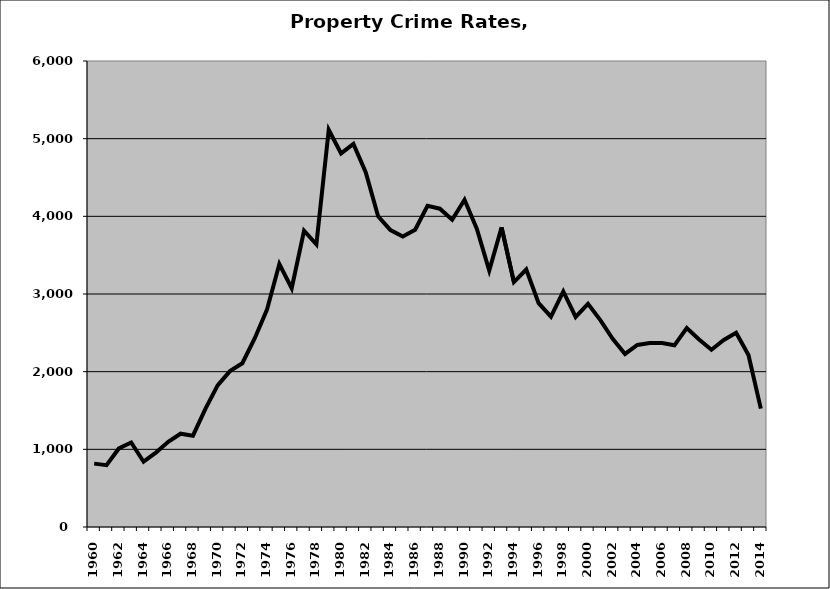
| Category | Property |
|---|---|
| 1960.0 | 815.89 |
| 1961.0 | 796.709 |
| 1962.0 | 1011.282 |
| 1963.0 | 1087.692 |
| 1964.0 | 840.587 |
| 1965.0 | 957.935 |
| 1966.0 | 1097.284 |
| 1967.0 | 1201.199 |
| 1968.0 | 1175.355 |
| 1969.0 | 1517.995 |
| 1970.0 | 1823.12 |
| 1971.0 | 2007.642 |
| 1972.0 | 2108.225 |
| 1973.0 | 2427.586 |
| 1974.0 | 2799.574 |
| 1975.0 | 3385.987 |
| 1976.0 | 3073.95 |
| 1977.0 | 3814.493 |
| 1978.0 | 3640.246 |
| 1979.0 | 5115.01 |
| 1980.0 | 4809.71 |
| 1981.0 | 4932.816 |
| 1982.0 | 4564.922 |
| 1983.0 | 4000.19 |
| 1984.0 | 3822.83 |
| 1985.0 | 3740.374 |
| 1986.0 | 3827.726 |
| 1987.0 | 4134.672 |
| 1988.0 | 4098.201 |
| 1989.0 | 3955.732 |
| 1990.0 | 4213.712 |
| 1991.0 | 3838.448 |
| 1992.0 | 3300.526 |
| 1993.0 | 3858.16 |
| 1994.0 | 3153.448 |
| 1995.0 | 3315.385 |
| 1996.0 | 2881.664 |
| 1997.0 | 2708.489 |
| 1998.0 | 3032.826 |
| 1999.0 | 2704.719 |
| 2000.0 | 2873.394 |
| 2001.0 | 2664.696 |
| 2002.0 | 2424.044 |
| 2003.0 | 2228.652 |
| 2004.0 | 2343.565 |
| 2005.0 | 2369.747 |
| 2006.0 | 2367.977 |
| 2007.0 | 2338.979 |
| 2008.0 | 2560.668 |
| 2009.0 | 2414.115 |
| 2010.0 | 2282.254 |
| 2011.0 | 2407.627 |
| 2012.0 | 2500.667 |
| 2013.0 | 2214.547 |
| 2014.0 | 1524.35 |